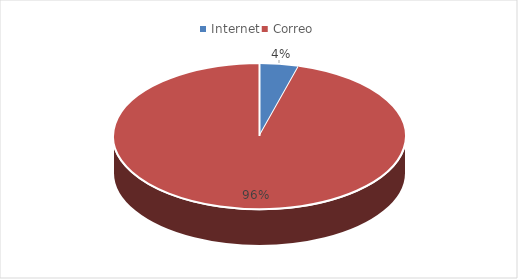
| Category | Series 0 |
|---|---|
| Internet | 1 |
| Correo | 22 |